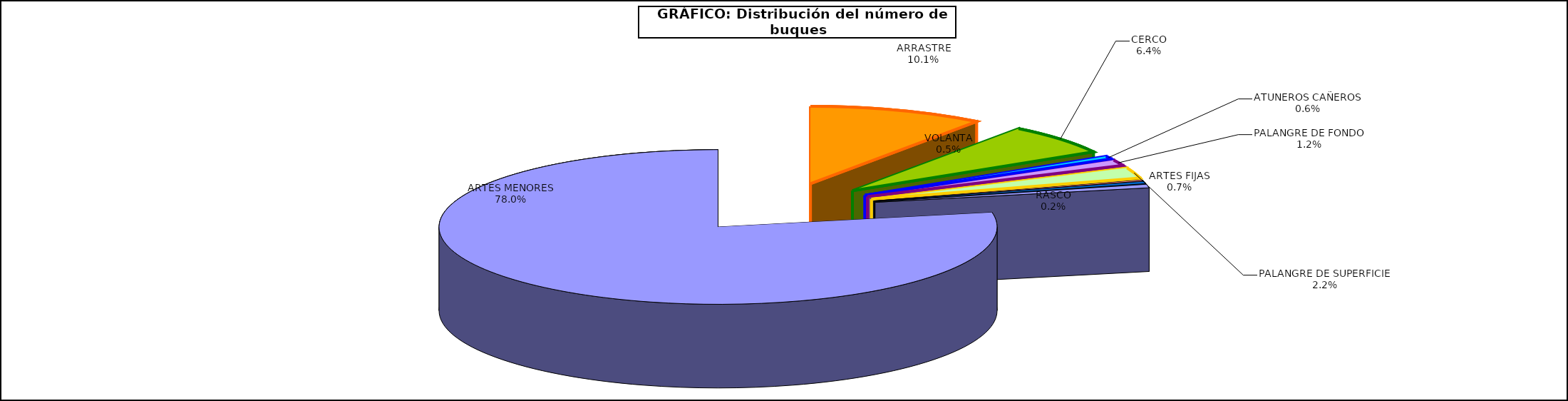
| Category | Series 0 |
|---|---|
| ARRASTRE | 897 |
| CERCO | 570 |
| ATUNEROS CAÑEROS | 53 |
| PALANGRE DE FONDO | 107 |
| PALANGRE DE SUPERFICIE | 196 |
| RASCO | 21 |
| VOLANTA | 40 |
| ARTES FIJAS | 60 |
| ARTES MENORES | 6895 |